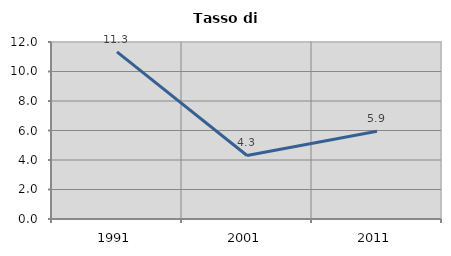
| Category | Tasso di disoccupazione   |
|---|---|
| 1991.0 | 11.327 |
| 2001.0 | 4.308 |
| 2011.0 | 5.946 |